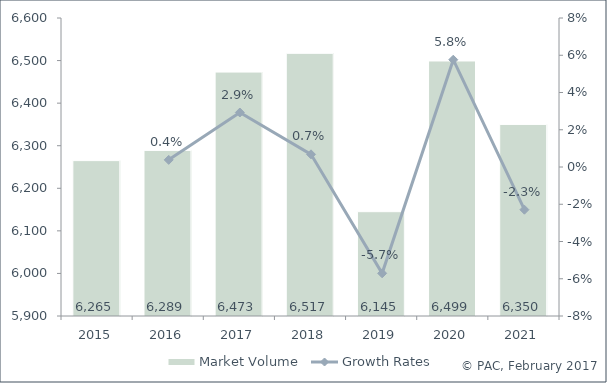
| Category | Market Volume |
|---|---|
| 2015.0 | 6265 |
| 2016.0 | 6289 |
| 2017.0 | 6473 |
| 2018.0 | 6517 |
| 2019.0 | 6145 |
| 2020.0 | 6499 |
| 2021.0 | 6350 |